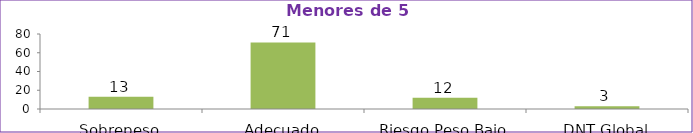
| Category | Series 0 |
|---|---|
| Sobrepeso | 13 |
| Adecuado | 71 |
| Riesgo Peso Bajo | 12 |
| DNT Global | 3 |